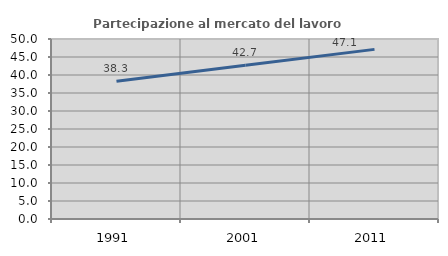
| Category | Partecipazione al mercato del lavoro  femminile |
|---|---|
| 1991.0 | 38.276 |
| 2001.0 | 42.715 |
| 2011.0 | 47.119 |